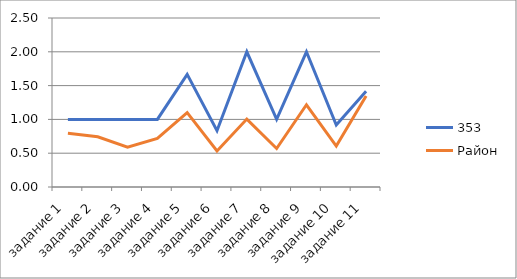
| Category | 353 | Район |
|---|---|---|
| задание 1 | 1 | 0.794 |
| задание 2 | 1 | 0.743 |
| задание 3 | 1 | 0.59 |
| задание 4 | 1 | 0.719 |
| задание 5 | 1.667 | 1.101 |
| задание 6 | 0.833 | 0.533 |
| задание 7 | 2 | 1.005 |
| задание 8 | 1 | 0.569 |
| задание 9 | 2 | 1.217 |
| задание 10 | 0.917 | 0.606 |
| задание 11 | 1.417 | 1.346 |